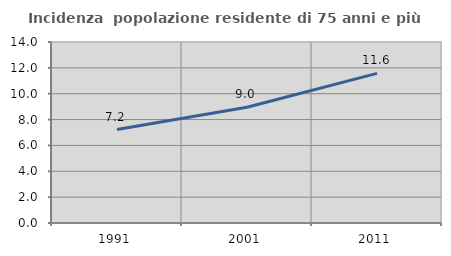
| Category | Incidenza  popolazione residente di 75 anni e più |
|---|---|
| 1991.0 | 7.231 |
| 2001.0 | 8.951 |
| 2011.0 | 11.573 |